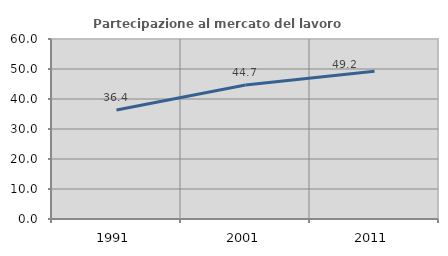
| Category | Partecipazione al mercato del lavoro  femminile |
|---|---|
| 1991.0 | 36.364 |
| 2001.0 | 44.697 |
| 2011.0 | 49.246 |